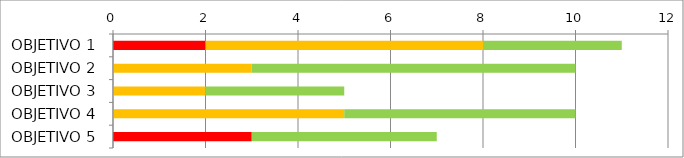
| Category | Series 0 | Series 1 | Series 2 | Series 3 | Series 4 | Series 5 |
|---|---|---|---|---|---|---|
| OBJETIVO 1 | 0 | 0 | 2 | 6 | 3 | 0 |
| OBJETIVO 2 | 0 | 0 | 0 | 3 | 7 | 0 |
| OBJETIVO 3 | 0 | 0 | 0 | 2 | 3 | 0 |
| OBJETIVO 4 | 0 | 0 | 0 | 5 | 5 | 0 |
| OBJETIVO 5 | 0 | 0 | 3 | 0 | 4 | 0 |